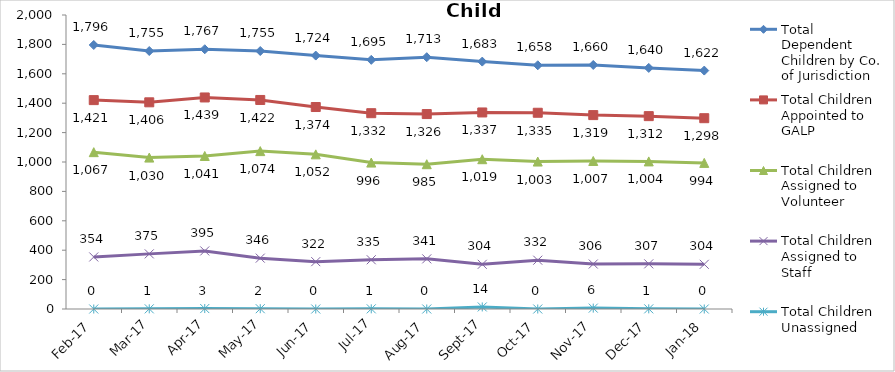
| Category | Total Dependent Children by Co. of Jurisdiction | Total Children Appointed to GALP | Total Children Assigned to Volunteer | Total Children Assigned to Staff | Total Children Unassigned |
|---|---|---|---|---|---|
| 2017-02-01 | 1796 | 1421 | 1067 | 354 | 0 |
| 2017-03-01 | 1755 | 1406 | 1030 | 375 | 1 |
| 2017-04-01 | 1767 | 1439 | 1041 | 395 | 3 |
| 2017-05-01 | 1755 | 1422 | 1074 | 346 | 2 |
| 2017-06-01 | 1724 | 1374 | 1052 | 322 | 0 |
| 2017-07-01 | 1695 | 1332 | 996 | 335 | 1 |
| 2017-08-01 | 1713 | 1326 | 985 | 341 | 0 |
| 2017-09-01 | 1683 | 1337 | 1019 | 304 | 14 |
| 2017-10-01 | 1658 | 1335 | 1003 | 332 | 0 |
| 2017-11-01 | 1660 | 1319 | 1007 | 306 | 6 |
| 2017-12-01 | 1640 | 1312 | 1004 | 307 | 1 |
| 2018-01-01 | 1622 | 1298 | 994 | 304 | 0 |